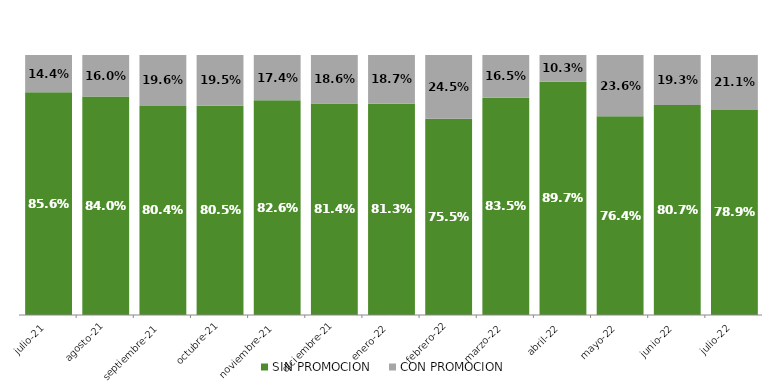
| Category | SIN PROMOCION   | CON PROMOCION   |
|---|---|---|
| 2021-07-01 | 0.856 | 0.144 |
| 2021-08-01 | 0.84 | 0.16 |
| 2021-09-01 | 0.804 | 0.196 |
| 2021-10-01 | 0.805 | 0.195 |
| 2021-11-01 | 0.826 | 0.174 |
| 2021-12-01 | 0.814 | 0.186 |
| 2022-01-01 | 0.813 | 0.187 |
| 2022-02-01 | 0.755 | 0.245 |
| 2022-03-01 | 0.835 | 0.165 |
| 2022-04-01 | 0.897 | 0.103 |
| 2022-05-01 | 0.764 | 0.236 |
| 2022-06-01 | 0.807 | 0.193 |
| 2022-07-01 | 0.789 | 0.211 |